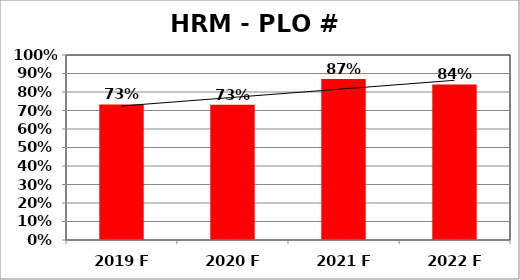
| Category | Series 0 |
|---|---|
| 2019 F | 0.733 |
| 2020 F | 0.731 |
| 2021 F | 0.87 |
| 2022 F | 0.841 |